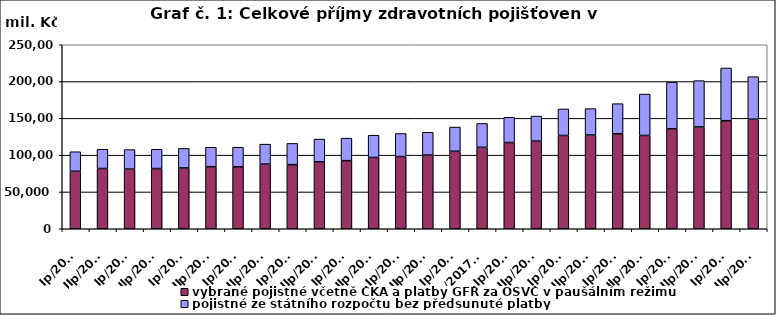
| Category | vybrané pojistné včetně ČKA a platby GFŘ za OSVČ v paušálním režimu | pojistné ze státního rozpočtu bez předsunuté platby |
|---|---|---|
| Ip/2010 | 78164.225 | 26486.11 |
| IIp/2010 | 81846.894 | 26220.675 |
| Ip/2011 | 81025.152 | 26519.003 |
| IIp/2011 | 81829.514 | 26206.267 |
| Ip/2012 | 82644.095 | 26526.738 |
| IIp/2012 | 84366.651 | 26347.951 |
| Ip/2013 | 84211.567 | 26574.921 |
| IIp/2013 | 87850.388 | 27101.376 |
| Ip/2014 | 87081.705 | 28902.722 |
| IIp/2014 | 90887.501 | 30964.468 |
| Ip/2015 | 92502.478 | 30659.689 |
| IIp/2015 | 96837.338 | 30284.703 |
| Ip/2016 | 98089.579 | 31309.421 |
| IIp/2016 | 100135.265 | 30944.105 |
| Ip/2017 | 105356.212 | 32802.787 |
| IIp/2017 *) | 110643.788 | 32450.77 |
| Ip/2018 | 117147.402 | 34300.507 |
| IIp/2018 | 119061.49 | 34058.935 |
| Ip/2019 | 126778.547 | 35989.245 |
| IIp/2019 | 127408.598 | 35859.876 |
| Ip/2020 | 128959.669 | 41017.244 |
| IIp/2020 | 126763.905 | 56244.889 |
| Ip/2021 | 135711.887 | 63418.922 |
| IIp/2021 | 138356.864 | 62903.468 |
| Ip/2022 | 146818.159 | 71633.862 |
| IIp/2022 | 148879.809 | 57762.184 |